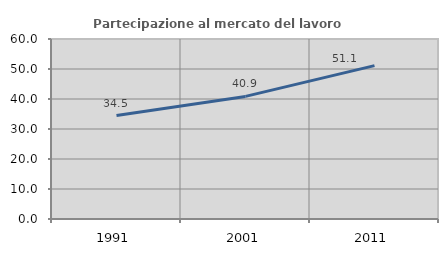
| Category | Partecipazione al mercato del lavoro  femminile |
|---|---|
| 1991.0 | 34.498 |
| 2001.0 | 40.87 |
| 2011.0 | 51.131 |